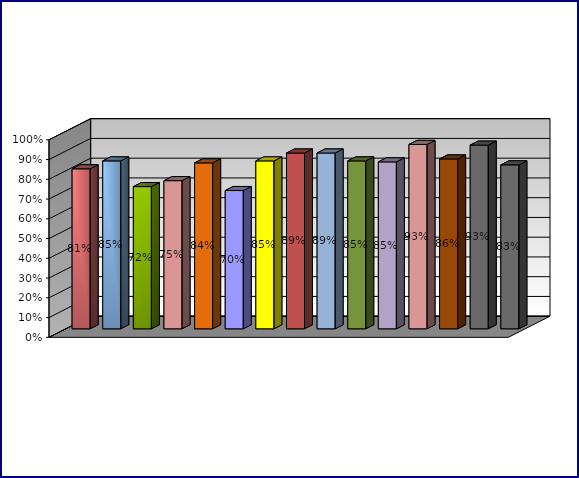
| Category | Series 0 | Series 1 | Series 2 | Series 3 |
|---|---|---|---|---|
| 0 | 0.81 |  |  |  |
| 1 | 0.85 |  |  |  |
| 2 | 0.72 |  |  |  |
| 3 | 0.75 |  |  |  |
| 4 | 0.84 |  |  |  |
| 5 | 0.7 |  |  |  |
| 6 | 0.85 |  |  |  |
| 7 | 0.89 |  |  |  |
| 8 | 0.89 |  |  |  |
| 9 | 0.85 |  |  |  |
| 10 | 0.845 |  |  |  |
| 11 | 0.933 |  |  |  |
| 12 | 0.86 |  |  |  |
| 13 | 0.93 |  |  |  |
| 14 | 0.83 |  |  |  |